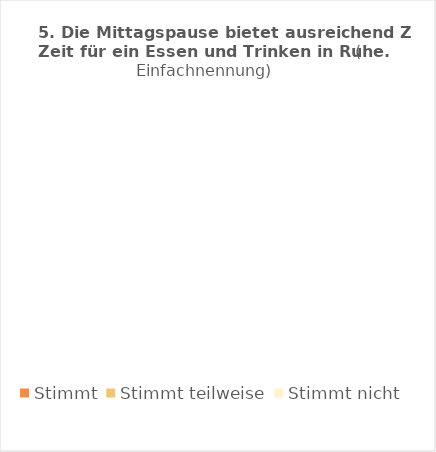
| Category | Series 0 | Series 1 |
|---|---|---|
| Stimmt |  | 0 |
| Stimmt teilweise |  | 0 |
| Stimmt nicht |  | 0 |